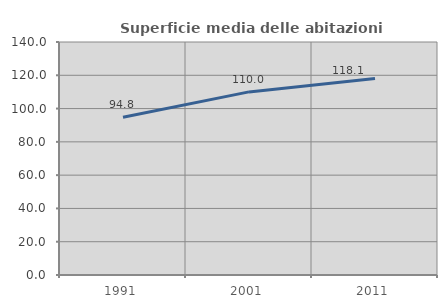
| Category | Superficie media delle abitazioni occupate |
|---|---|
| 1991.0 | 94.813 |
| 2001.0 | 110.015 |
| 2011.0 | 118.098 |